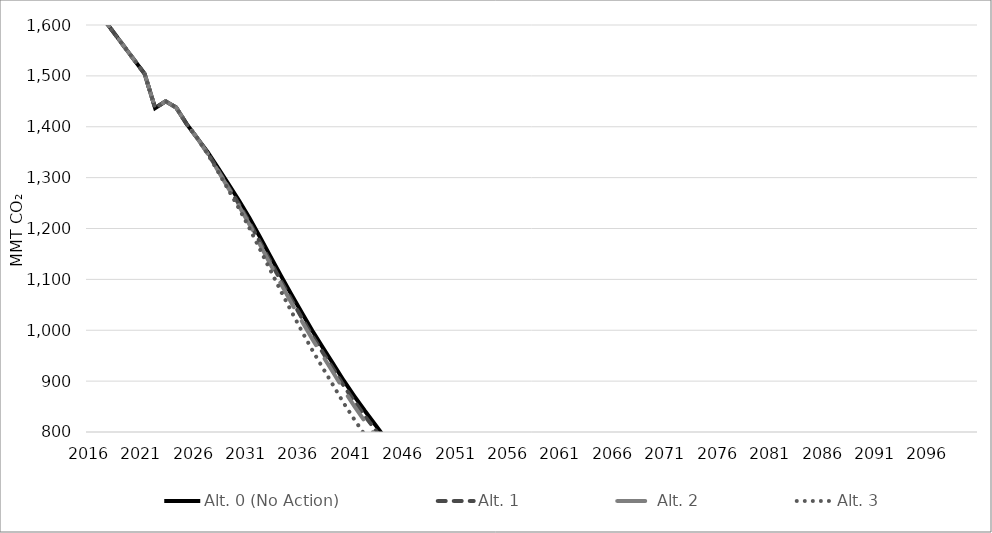
| Category | Alt. 0 (No Action) | Alt. 1 | Alt. 2 | Alt. 3 |
|---|---|---|---|---|
| 2016.0 | 1641.576 | 1641.576 | 1641.576 | 1641.576 |
| 2017.0 | 1614.032 | 1614.032 | 1614.032 | 1614.032 |
| 2018.0 | 1586.488 | 1586.488 | 1586.488 | 1586.488 |
| 2019.0 | 1558.944 | 1558.944 | 1558.944 | 1558.944 |
| 2020.0 | 1531.4 | 1531.4 | 1531.4 | 1531.4 |
| 2021.0 | 1503.856 | 1503.856 | 1503.856 | 1503.856 |
| 2022.0 | 1436.757 | 1436.757 | 1436.757 | 1436.757 |
| 2023.0 | 1450.133 | 1450.133 | 1450.133 | 1450.133 |
| 2024.0 | 1438.015 | 1438.015 | 1438.015 | 1438.015 |
| 2025.0 | 1405.595 | 1405.595 | 1405.595 | 1405.595 |
| 2026.0 | 1378.201 | 1378.201 | 1378.201 | 1378.201 |
| 2027.0 | 1350.345 | 1348.344 | 1347.694 | 1346.87 |
| 2028.0 | 1319.186 | 1315.145 | 1313.64 | 1311.746 |
| 2029.0 | 1287.335 | 1281.248 | 1278.879 | 1275.835 |
| 2030.0 | 1255.016 | 1247.696 | 1244.408 | 1239.313 |
| 2031.0 | 1220.561 | 1211.959 | 1207.811 | 1200.457 |
| 2032.0 | 1183.349 | 1173.446 | 1168.385 | 1159.086 |
| 2033.0 | 1145.247 | 1135.02 | 1129.552 | 1117.77 |
| 2034.0 | 1107.354 | 1097.131 | 1091.231 | 1076.762 |
| 2035.0 | 1070.324 | 1060.13 | 1053.863 | 1036.939 |
| 2036.0 | 1034.398 | 1024.048 | 1017.624 | 998.075 |
| 2037.0 | 999.132 | 988.897 | 982.32 | 960.602 |
| 2038.0 | 965.859 | 955.987 | 949.469 | 925.632 |
| 2039.0 | 933.605 | 923.824 | 916.517 | 891.308 |
| 2040.0 | 900.773 | 890.665 | 882.524 | 856.441 |
| 2041.0 | 870.56 | 860.487 | 851.07 | 824.711 |
| 2042.0 | 841.714 | 831.652 | 821.336 | 794.481 |
| 2043.0 | 814.258 | 804.421 | 793.355 | 766.225 |
| 2044.0 | 786.663 | 776.923 | 764.78 | 737.918 |
| 2045.0 | 757.102 | 748.471 | 735.718 | 709.656 |
| 2046.0 | 726.731 | 719.567 | 706.779 | 680.562 |
| 2047.0 | 697.172 | 691.495 | 678.631 | 652.402 |
| 2048.0 | 668.744 | 664.508 | 651.649 | 625.116 |
| 2049.0 | 638.862 | 635.883 | 623.181 | 596.738 |
| 2050.0 | 608.103 | 606.14 | 593.898 | 567.723 |
| 2051.0 | 607.791 | 605.829 | 593.592 | 567.431 |
| 2052.0 | 607.478 | 605.517 | 593.287 | 567.139 |
| 2053.0 | 607.166 | 605.206 | 592.982 | 566.847 |
| 2054.0 | 606.853 | 604.894 | 592.677 | 566.556 |
| 2055.0 | 606.541 | 604.583 | 592.372 | 566.264 |
| 2056.0 | 606.228 | 604.271 | 592.066 | 565.972 |
| 2057.0 | 605.916 | 603.96 | 591.761 | 565.68 |
| 2058.0 | 605.603 | 603.648 | 591.456 | 565.388 |
| 2059.0 | 605.291 | 603.337 | 591.151 | 565.097 |
| 2060.0 | 604.978 | 603.025 | 590.845 | 564.805 |
| 2061.0 | 604.665 | 602.714 | 590.54 | 564.513 |
| 2062.0 | 604.353 | 602.402 | 590.235 | 564.221 |
| 2063.0 | 604.04 | 602.091 | 589.93 | 563.93 |
| 2064.0 | 603.728 | 601.779 | 589.625 | 563.638 |
| 2065.0 | 603.415 | 601.467 | 589.319 | 563.346 |
| 2066.0 | 603.235 | 601.288 | 589.143 | 563.178 |
| 2067.0 | 603.055 | 601.108 | 588.967 | 563.009 |
| 2068.0 | 602.875 | 600.928 | 588.791 | 562.841 |
| 2069.0 | 602.694 | 600.749 | 588.615 | 562.673 |
| 2070.0 | 602.514 | 600.569 | 588.439 | 562.505 |
| 2071.0 | 602.334 | 600.389 | 588.263 | 562.336 |
| 2072.0 | 602.154 | 600.21 | 588.087 | 562.168 |
| 2073.0 | 601.973 | 600.03 | 587.911 | 562 |
| 2074.0 | 601.793 | 599.85 | 587.735 | 561.831 |
| 2075.0 | 601.613 | 599.671 | 587.559 | 561.663 |
| 2076.0 | 601.432 | 599.491 | 587.383 | 561.495 |
| 2077.0 | 601.252 | 599.311 | 587.207 | 561.326 |
| 2078.0 | 601.072 | 599.132 | 587.031 | 561.158 |
| 2079.0 | 600.892 | 598.952 | 586.855 | 560.99 |
| 2080.0 | 600.711 | 598.772 | 586.679 | 560.822 |
| 2081.0 | 597.912 | 595.982 | 583.944 | 558.208 |
| 2082.0 | 595.112 | 593.191 | 581.21 | 555.594 |
| 2083.0 | 592.312 | 590.4 | 578.476 | 552.98 |
| 2084.0 | 589.513 | 587.61 | 575.741 | 550.367 |
| 2085.0 | 586.713 | 584.819 | 573.007 | 547.753 |
| 2086.0 | 583.913 | 582.028 | 570.273 | 545.139 |
| 2087.0 | 581.114 | 579.238 | 567.539 | 542.525 |
| 2088.0 | 578.314 | 576.447 | 564.804 | 539.911 |
| 2089.0 | 575.514 | 573.656 | 562.07 | 537.298 |
| 2090.0 | 572.715 | 570.866 | 559.336 | 534.684 |
| 2091.0 | 569.915 | 568.075 | 556.601 | 532.07 |
| 2092.0 | 567.115 | 565.285 | 553.867 | 529.456 |
| 2093.0 | 564.316 | 562.494 | 551.133 | 526.843 |
| 2094.0 | 561.516 | 559.703 | 548.399 | 524.229 |
| 2095.0 | 558.716 | 556.913 | 545.664 | 521.615 |
| 2096.0 | 558.716 | 556.913 | 545.664 | 521.615 |
| 2097.0 | 558.716 | 556.913 | 545.664 | 521.615 |
| 2098.0 | 558.716 | 556.913 | 545.664 | 521.615 |
| 2099.0 | 558.716 | 556.913 | 545.664 | 521.615 |
| 2100.0 | 558.716 | 556.913 | 545.664 | 521.615 |